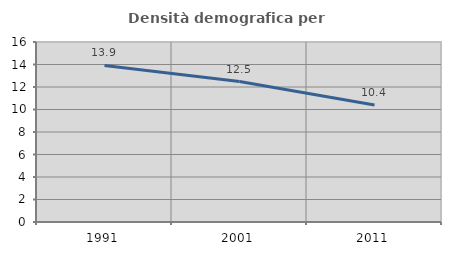
| Category | Densità demografica |
|---|---|
| 1991.0 | 13.921 |
| 2001.0 | 12.482 |
| 2011.0 | 10.392 |